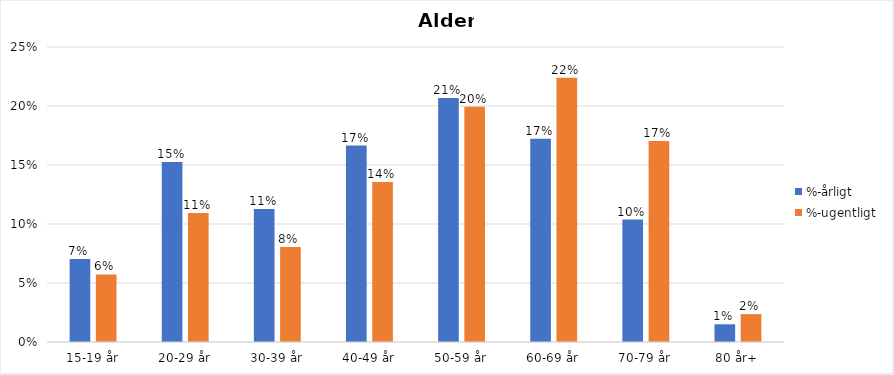
| Category | %-årligt | %-ugentligt |
|---|---|---|
| 15-19 år | 0.07 | 0.057 |
| 20-29 år | 0.153 | 0.109 |
| 30-39 år | 0.113 | 0.081 |
| 40-49 år | 0.166 | 0.136 |
| 50-59 år | 0.207 | 0.199 |
| 60-69 år | 0.172 | 0.224 |
| 70-79 år | 0.104 | 0.17 |
| 80 år+ | 0.015 | 0.024 |